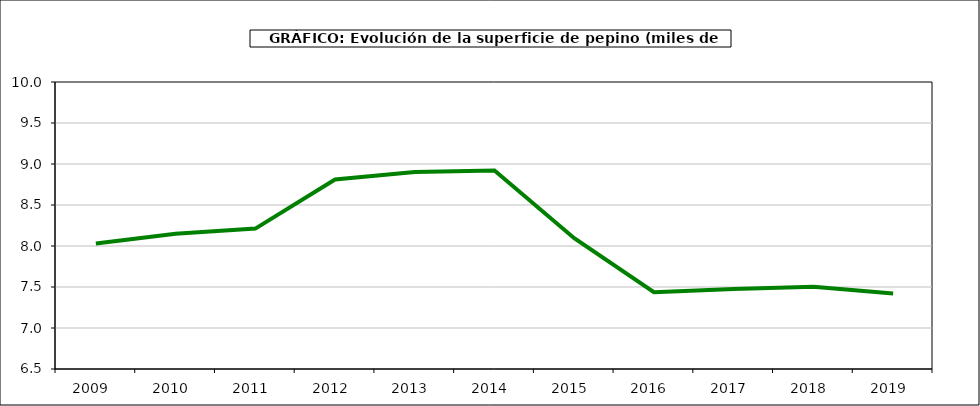
| Category | superficie |
|---|---|
| 2009.0 | 8.031 |
| 2010.0 | 8.148 |
| 2011.0 | 8.212 |
| 2012.0 | 8.811 |
| 2013.0 | 8.902 |
| 2014.0 | 8.921 |
| 2015.0 | 8.095 |
| 2016.0 | 7.437 |
| 2017.0 | 7.475 |
| 2018.0 | 7.503 |
| 2019.0 | 7.422 |